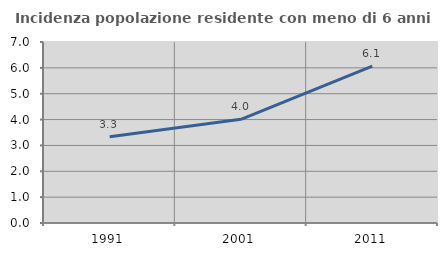
| Category | Incidenza popolazione residente con meno di 6 anni |
|---|---|
| 1991.0 | 3.338 |
| 2001.0 | 4.009 |
| 2011.0 | 6.067 |